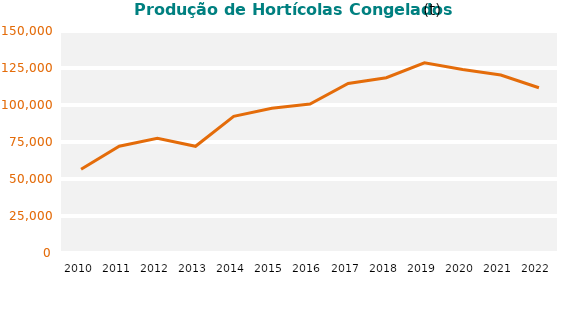
| Category | Series 1 |
|---|---|
| 2010 | 56639.683 |
| 2011 | 72148.502 |
| 2012 | 77506.954 |
| 2013 | 72100.778 |
| 2014 | 92321.854 |
| 2015 | 97825.148 |
| 2016 | 100680.417 |
| 2017 | 114564.745 |
| 2018 | 118401.517 |
| 2019 | 128481.524 |
| 2020 | 123944.899 |
| 2021 | 120228.506 |
| 2022 | 111675.468 |